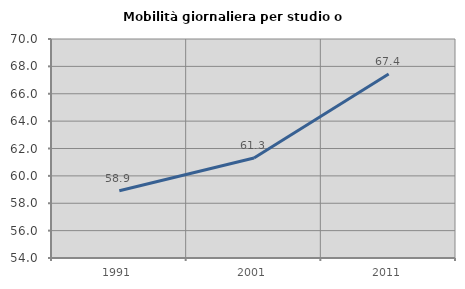
| Category | Mobilità giornaliera per studio o lavoro |
|---|---|
| 1991.0 | 58.911 |
| 2001.0 | 61.306 |
| 2011.0 | 67.449 |